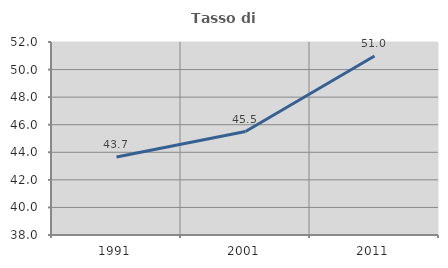
| Category | Tasso di occupazione   |
|---|---|
| 1991.0 | 43.658 |
| 2001.0 | 45.505 |
| 2011.0 | 50.983 |